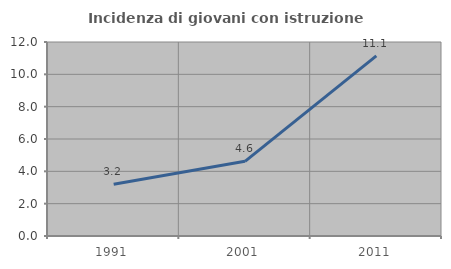
| Category | Incidenza di giovani con istruzione universitaria |
|---|---|
| 1991.0 | 3.199 |
| 2001.0 | 4.62 |
| 2011.0 | 11.143 |